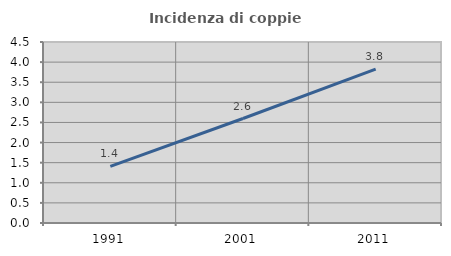
| Category | Incidenza di coppie miste |
|---|---|
| 1991.0 | 1.407 |
| 2001.0 | 2.597 |
| 2011.0 | 3.828 |